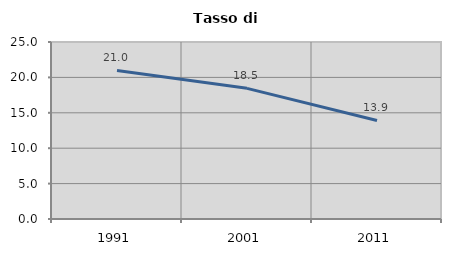
| Category | Tasso di disoccupazione   |
|---|---|
| 1991.0 | 20.984 |
| 2001.0 | 18.453 |
| 2011.0 | 13.919 |